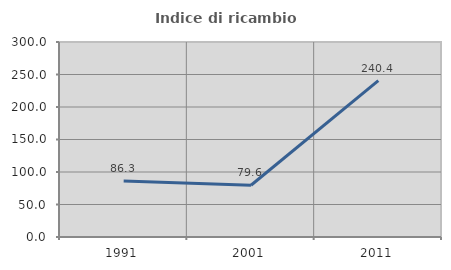
| Category | Indice di ricambio occupazionale  |
|---|---|
| 1991.0 | 86.275 |
| 2001.0 | 79.612 |
| 2011.0 | 240.441 |